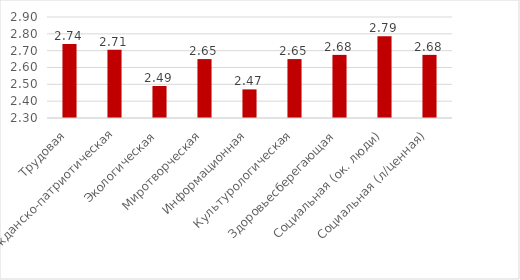
| Category | Series 0 |
|---|---|
| Трудовая | 2.74 |
| Гражданско-патриотическая | 2.705 |
| Экологическая | 2.49 |
| Миротворческая | 2.65 |
| Информационная | 2.47 |
| Культурологическая | 2.65 |
| Здоровьесберегающая | 2.675 |
| Социальная (ок. люди) | 2.785 |
| Социальная (л/ценная) | 2.675 |